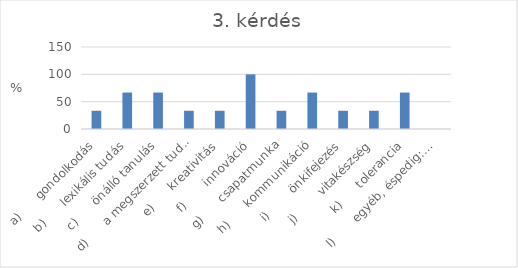
| Category | Series 0 |
|---|---|
| a)      gondolkodás | 33.33 |
| b)      lexikális tudás | 66.67 |
| c)      önálló tanulás | 66.67 |
| d)      a megszerzett tudás alkalmazása | 33.33 |
| e)      kreativitás | 33.33 |
| f)       innováció | 100 |
| g)      csapatmunka | 33.33 |
| h)      kommunikáció | 66.67 |
| i)        önkifejezés | 33.33 |
| j)        vitakészség | 33.33 |
| k)      tolerancia | 66.67 |
| l)       egyéb, éspedig:… | 0 |